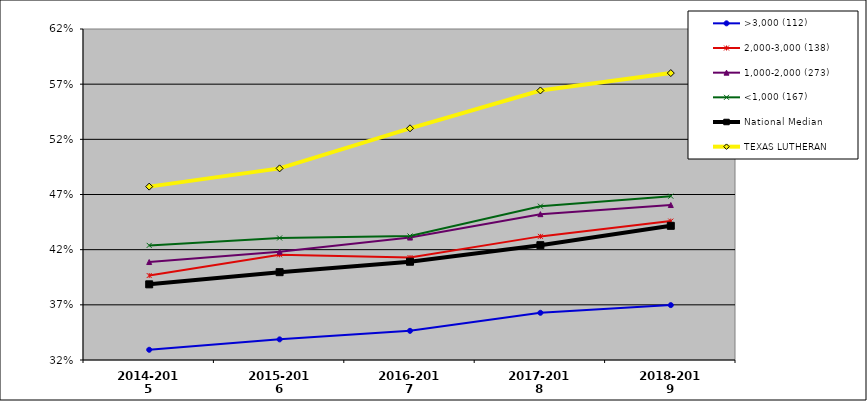
| Category | >3,000 (112) | 2,000-3,000 (138) | 1,000-2,000 (273) | <1,000 (167) | National Median | TEXAS LUTHERAN |
|---|---|---|---|---|---|---|
| 2014-2015 | 0.329 | 0.397 | 0.409 | 0.424 | 0.389 | 0.477 |
| 2015-2016 | 0.339 | 0.415 | 0.418 | 0.431 | 0.4 | 0.494 |
| 2016-2017 | 0.346 | 0.413 | 0.431 | 0.432 | 0.409 | 0.53 |
| 2017-2018 | 0.363 | 0.432 | 0.452 | 0.459 | 0.424 | 0.564 |
| 2018-2019 | 0.37 | 0.446 | 0.46 | 0.468 | 0.442 | 0.58 |